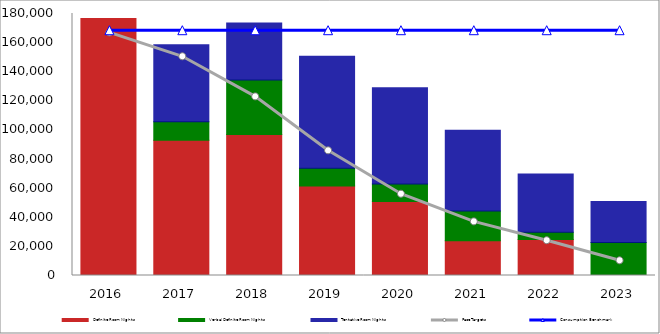
| Category | Definite Room Nights | Verbal Definite Room Nights | Tentative Room Nights |
|---|---|---|---|
| 2016.0 | 176583 | 0 | 0 |
| 2017.0 | 92984 | 12705 | 52896 |
| 2018.0 | 96840 | 37412 | 39211 |
| 2019.0 | 61568 | 12165 | 76852 |
| 2020.0 | 50851 | 12090 | 66077 |
| 2021.0 | 23925 | 20387 | 55552 |
| 2022.0 | 24769 | 5000 | 39974 |
| 2023.0 | 0 | 22743 | 28124 |